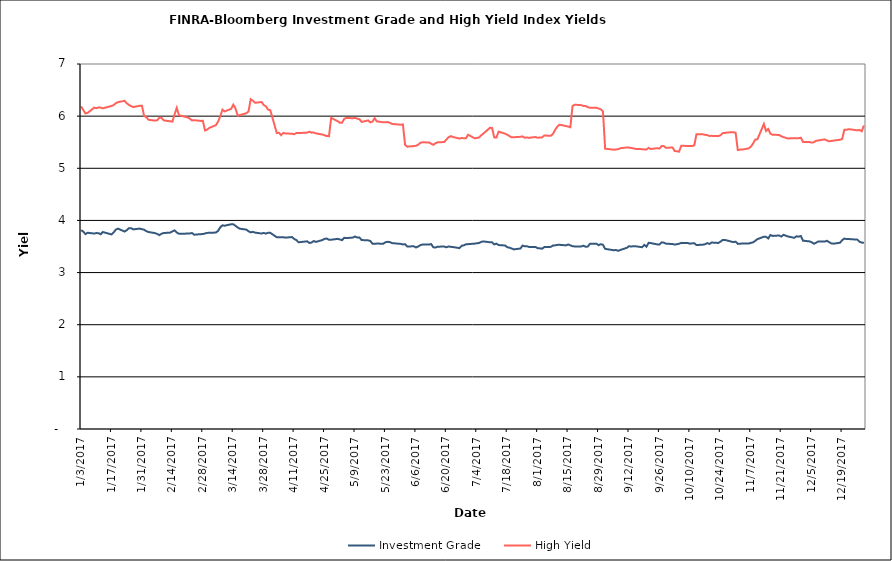
| Category | Investment Grade | High Yield |
|---|---|---|
| 1/3/17 | 3.813 | 6.187 |
| 1/4/17 | 3.787 | 6.118 |
| 1/5/17 | 3.738 | 6.052 |
| 1/6/17 | 3.764 | 6.062 |
| 1/9/17 | 3.748 | 6.163 |
| 1/10/17 | 3.757 | 6.152 |
| 1/11/17 | 3.756 | 6.168 |
| 1/12/17 | 3.736 | 6.164 |
| 1/13/17 | 3.777 | 6.15 |
| 1/17/17 | 3.731 | 6.195 |
| 1/18/17 | 3.771 | 6.212 |
| 1/19/17 | 3.825 | 6.249 |
| 1/20/17 | 3.842 | 6.269 |
| 1/23/17 | 3.787 | 6.294 |
| 1/24/17 | 3.812 | 6.246 |
| 1/25/17 | 3.851 | 6.217 |
| 1/26/17 | 3.852 | 6.191 |
| 1/27/17 | 3.828 | 6.175 |
| 1/30/17 | 3.844 | 6.199 |
| 1/31/17 | 3.83 | 6.198 |
| 2/1/17 | 3.822 | 6 |
| 2/2/17 | 3.794 | 5.98 |
| 2/3/17 | 3.778 | 5.93 |
| 2/6/17 | 3.756 | 5.914 |
| 2/7/17 | 3.742 | 5.92 |
| 2/8/17 | 3.718 | 5.972 |
| 2/9/17 | 3.745 | 5.966 |
| 2/10/17 | 3.758 | 5.919 |
| 2/13/17 | 3.767 | 5.901 |
| 2/14/17 | 3.791 | 5.894 |
| 2/15/17 | 3.809 | 6.036 |
| 2/16/17 | 3.768 | 6.159 |
| 2/17/17 | 3.746 | 6.018 |
| 2/21/17 | 3.747 | 5.975 |
| 2/22/17 | 3.75 | 5.952 |
| 2/23/17 | 3.76 | 5.918 |
| 2/24/17 | 3.726 | 5.923 |
| 2/27/17 | 3.737 | 5.908 |
| 2/28/17 | 3.738 | 5.911 |
| 3/1/17 | 3.75 | 5.725 |
| 3/2/17 | 3.761 | 5.743 |
| 3/3/17 | 3.762 | 5.776 |
| 3/6/17 | 3.768 | 5.827 |
| 3/7/17 | 3.8 | 5.896 |
| 3/8/17 | 3.867 | 5.997 |
| 3/9/17 | 3.907 | 6.125 |
| 3/10/17 | 3.898 | 6.09 |
| 3/13/17 | 3.927 | 6.14 |
| 3/14/17 | 3.927 | 6.219 |
| 3/15/17 | 3.897 | 6.151 |
| 3/16/17 | 3.865 | 6.009 |
| 3/17/17 | 3.842 | 6.021 |
| 3/20/17 | 3.824 | 6.056 |
| 3/21/17 | 3.792 | 6.09 |
| 3/22/17 | 3.771 | 6.325 |
| 3/23/17 | 3.781 | 6.296 |
| 3/24/17 | 3.766 | 6.255 |
| 3/27/17 | 3.749 | 6.272 |
| 3/28/17 | 3.76 | 6.213 |
| 3/29/17 | 3.747 | 6.188 |
| 3/30/17 | 3.763 | 6.125 |
| 3/31/17 | 3.764 | 6.115 |
| 4/3/17 | 3.676 | 5.676 |
| 4/4/17 | 3.677 | 5.683 |
| 4/5/17 | 3.677 | 5.635 |
| 4/6/17 | 3.677 | 5.679 |
| 4/7/17 | 3.67 | 5.666 |
| 4/10/17 | 3.681 | 5.664 |
| 4/11/17 | 3.644 | 5.653 |
| 4/12/17 | 3.625 | 5.675 |
| 4/13/17 | 3.581 | 5.674 |
| 4/17/17 | 3.599 | 5.685 |
| 4/18/17 | 3.567 | 5.702 |
| 4/19/17 | 3.577 | 5.684 |
| 4/20/17 | 3.605 | 5.684 |
| 4/21/17 | 3.588 | 5.67 |
| 4/24/17 | 3.625 | 5.647 |
| 4/25/17 | 3.647 | 5.632 |
| 4/26/17 | 3.652 | 5.618 |
| 4/27/17 | 3.63 | 5.616 |
| 4/28/17 | 3.63 | 5.967 |
| 5/1/17 | 3.646 | 5.903 |
| 5/2/17 | 3.635 | 5.873 |
| 5/3/17 | 3.621 | 5.874 |
| 5/4/17 | 3.666 | 5.947 |
| 5/5/17 | 3.661 | 5.966 |
| 5/8/17 | 3.671 | 5.96 |
| 5/9/17 | 3.691 | 5.967 |
| 5/10/17 | 3.672 | 5.951 |
| 5/11/17 | 3.672 | 5.942 |
| 5/12/17 | 3.624 | 5.89 |
| 5/15/17 | 3.618 | 5.918 |
| 5/16/17 | 3.607 | 5.882 |
| 5/17/17 | 3.553 | 5.896 |
| 5/18/17 | 3.552 | 5.961 |
| 5/19/17 | 3.556 | 5.9 |
| 5/22/17 | 3.554 | 5.882 |
| 5/23/17 | 3.582 | 5.882 |
| 5/24/17 | 3.59 | 5.888 |
| 5/25/17 | 3.584 | 5.872 |
| 5/26/17 | 3.565 | 5.85 |
| 5/30/17 | 3.55 | 5.836 |
| 5/31/17 | 3.54 | 5.842 |
| 6/1/17 | 3.544 | 5.45 |
| 6/2/17 | 3.498 | 5.414 |
| 6/5/17 | 3.505 | 5.426 |
| 6/6/17 | 3.481 | 5.432 |
| 6/7/17 | 3.499 | 5.451 |
| 6/8/17 | 3.524 | 5.488 |
| 6/9/17 | 3.537 | 5.498 |
| 6/12/17 | 3.537 | 5.496 |
| 6/13/17 | 3.546 | 5.472 |
| 6/14/17 | 3.485 | 5.449 |
| 6/15/17 | 3.481 | 5.482 |
| 6/16/17 | 3.497 | 5.498 |
| 6/19/17 | 3.498 | 5.503 |
| 6/20/17 | 3.485 | 5.551 |
| 6/21/17 | 3.501 | 5.596 |
| 6/22/17 | 3.494 | 5.618 |
| 6/23/17 | 3.49 | 5.602 |
| 6/26/17 | 3.469 | 5.569 |
| 6/27/17 | 3.514 | 5.582 |
| 6/28/17 | 3.522 | 5.575 |
| 6/29/17 | 3.542 | 5.577 |
| 6/30/17 | 3.545 | 5.644 |
| 7/3/17 | 3.555 | 5.574 |
| 7/5/17 | 3.568 | 5.59 |
| 7/6/17 | 3.588 | 5.633 |
| 7/7/17 | 3.598 | 5.665 |
| 7/10/17 | 3.581 | 5.776 |
| 7/11/17 | 3.581 | 5.773 |
| 7/12/17 | 3.54 | 5.592 |
| 7/13/17 | 3.555 | 5.59 |
| 7/14/17 | 3.528 | 5.704 |
| 7/17/17 | 3.52 | 5.663 |
| 7/18/17 | 3.486 | 5.643 |
| 7/19/17 | 3.478 | 5.618 |
| 7/20/17 | 3.462 | 5.593 |
| 7/21/17 | 3.445 | 5.596 |
| 7/24/17 | 3.461 | 5.603 |
| 7/25/17 | 3.517 | 5.611 |
| 7/26/17 | 3.505 | 5.586 |
| 7/27/17 | 3.506 | 5.591 |
| 7/28/17 | 3.491 | 5.585 |
| 7/31/17 | 3.49 | 5.599 |
| 8/1/17 | 3.467 | 5.586 |
| 8/2/17 | 3.465 | 5.591 |
| 8/3/17 | 3.458 | 5.593 |
| 8/4/17 | 3.488 | 5.629 |
| 8/7/17 | 3.493 | 5.623 |
| 8/8/17 | 3.519 | 5.66 |
| 8/9/17 | 3.522 | 5.738 |
| 8/10/17 | 3.531 | 5.799 |
| 8/11/17 | 3.533 | 5.836 |
| 8/14/17 | 3.521 | 5.81 |
| 8/15/17 | 3.539 | 5.8 |
| 8/16/17 | 3.522 | 5.786 |
| 8/17/17 | 3.506 | 6.195 |
| 8/18/17 | 3.501 | 6.219 |
| 8/21/17 | 3.502 | 6.211 |
| 8/22/17 | 3.514 | 6.196 |
| 8/23/17 | 3.496 | 6.192 |
| 8/24/17 | 3.498 | 6.174 |
| 8/25/17 | 3.551 | 6.16 |
| 8/28/17 | 3.554 | 6.162 |
| 8/29/17 | 3.525 | 6.145 |
| 8/30/17 | 3.545 | 6.133 |
| 8/31/17 | 3.532 | 6.088 |
| 9/1/17 | 3.455 | 5.375 |
| 9/5/17 | 3.428 | 5.357 |
| 9/6/17 | 3.433 | 5.362 |
| 9/7/17 | 3.416 | 5.367 |
| 9/8/17 | 3.434 | 5.384 |
| 9/11/17 | 3.476 | 5.399 |
| 9/12/17 | 3.506 | 5.399 |
| 9/13/17 | 3.498 | 5.388 |
| 9/14/17 | 3.507 | 5.383 |
| 9/15/17 | 3.504 | 5.372 |
| 9/18/17 | 3.486 | 5.366 |
| 9/19/17 | 3.531 | 5.361 |
| 9/20/17 | 3.496 | 5.362 |
| 9/21/17 | 3.571 | 5.392 |
| 9/22/17 | 3.564 | 5.37 |
| 9/25/17 | 3.541 | 5.386 |
| 9/26/17 | 3.54 | 5.378 |
| 9/27/17 | 3.579 | 5.427 |
| 9/28/17 | 3.574 | 5.425 |
| 9/29/17 | 3.554 | 5.391 |
| 10/2/17 | 3.547 | 5.399 |
| 10/3/17 | 3.537 | 5.331 |
| 10/4/17 | 3.544 | 5.327 |
| 10/5/17 | 3.552 | 5.319 |
| 10/6/17 | 3.57 | 5.432 |
| 10/9/17 | 3.566 | 5.428 |
| 10/10/17 | 3.554 | 5.428 |
| 10/11/17 | 3.56 | 5.427 |
| 10/12/17 | 3.562 | 5.442 |
| 10/13/17 | 3.528 | 5.654 |
| 10/16/17 | 3.536 | 5.65 |
| 10/17/17 | 3.544 | 5.641 |
| 10/18/17 | 3.565 | 5.635 |
| 10/19/17 | 3.549 | 5.621 |
| 10/20/17 | 3.576 | 5.622 |
| 10/23/17 | 3.568 | 5.618 |
| 10/24/17 | 3.592 | 5.631 |
| 10/25/17 | 3.625 | 5.674 |
| 10/26/17 | 3.627 | 5.676 |
| 10/27/17 | 3.616 | 5.687 |
| 10/30/17 | 3.584 | 5.691 |
| 10/31/17 | 3.593 | 5.683 |
| 11/1/17 | 3.55 | 5.35 |
| 11/2/17 | 3.552 | 5.358 |
| 11/3/17 | 3.558 | 5.358 |
| 11/6/17 | 3.556 | 5.381 |
| 11/7/17 | 3.57 | 5.414 |
| 11/8/17 | 3.578 | 5.474 |
| 11/9/17 | 3.608 | 5.55 |
| 11/10/17 | 3.641 | 5.555 |
| 11/13/17 | 3.688 | 5.85 |
| 11/14/17 | 3.686 | 5.715 |
| 11/15/17 | 3.654 | 5.755 |
| 11/16/17 | 3.721 | 5.664 |
| 11/17/17 | 3.703 | 5.643 |
| 11/20/17 | 3.711 | 5.639 |
| 11/21/17 | 3.69 | 5.614 |
| 11/22/17 | 3.725 | 5.598 |
| 11/24/17 | 3.693 | 5.571 |
| 11/27/17 | 3.667 | 5.578 |
| 11/28/17 | 3.696 | 5.578 |
| 11/29/17 | 3.689 | 5.578 |
| 11/30/17 | 3.702 | 5.586 |
| 12/1/17 | 3.611 | 5.504 |
| 12/4/17 | 3.598 | 5.502 |
| 12/5/17 | 3.581 | 5.494 |
| 12/6/17 | 3.553 | 5.5 |
| 12/7/17 | 3.573 | 5.527 |
| 12/8/17 | 3.597 | 5.534 |
| 12/11/17 | 3.594 | 5.555 |
| 12/12/17 | 3.61 | 5.533 |
| 12/13/17 | 3.583 | 5.517 |
| 12/14/17 | 3.56 | 5.525 |
| 12/15/17 | 3.554 | 5.531 |
| 12/18/17 | 3.572 | 5.548 |
| 12/19/17 | 3.621 | 5.562 |
| 12/20/17 | 3.652 | 5.74 |
| 12/21/17 | 3.643 | 5.738 |
| 12/22/17 | 3.643 | 5.751 |
| 12/26/17 | 3.632 | 5.728 |
| 12/27/17 | 3.59 | 5.736 |
| 12/28/17 | 3.576 | 5.709 |
| 12/29/17 | 3.568 | 5.822 |